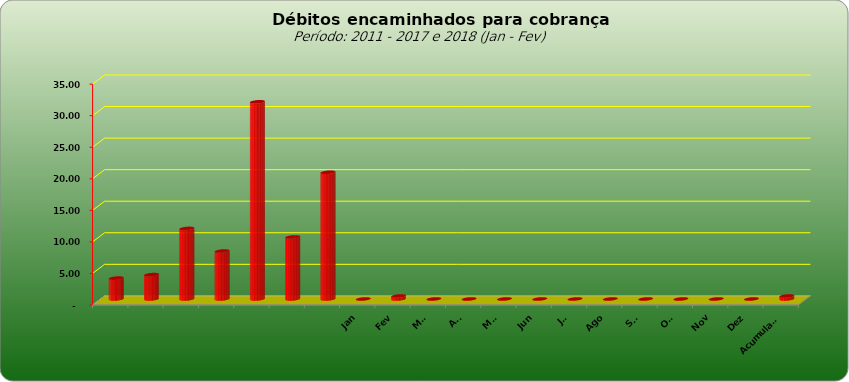
| Category |  3.309.443,02  |
|---|---|
|  | 3309443.02 |
|  | 3859728.44 |
|  | 11181928.25 |
|  | 7600526.01 |
|  | 31248623.5 |
|  | 9830198.34 |
|  | 20083556.95 |
| Jan | 0 |
| Fev | 468831.1 |
| Mar | 0 |
| Abr | 0 |
| Mai | 0 |
| Jun | 0 |
| Jul | 0 |
| Ago | 0 |
| Set | 0 |
| Out | 0 |
| Nov | 0 |
| Dez | 0 |
| Acumulado | 468831.1 |